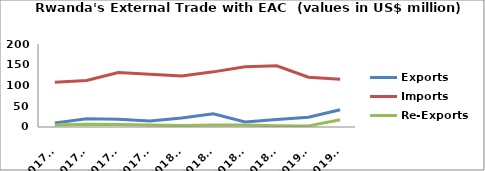
| Category | Exports | Imports | Re-Exports |
|---|---|---|---|
| 2017Q1 | 9.664 | 107.939 | 4.884 |
| 2017Q2 | 19.646 | 112.299 | 6.46 |
| 2017Q3 | 18.919 | 131.397 | 5.955 |
| 2017Q4 | 14.466 | 126.939 | 4.636 |
| 2018Q1 | 21.787 | 122.952 | 3.88 |
| 2018Q2 | 31.913 | 132.868 | 4.622 |
| 2018Q3 | 12.298 | 145.348 | 4.725 |
| 2018Q4 | 18.335 | 147.432 | 2.99 |
| 2019Q1 | 23.42 | 119.935 | 2.57 |
| 2019Q2 | 41.554 | 115.098 | 17.51 |